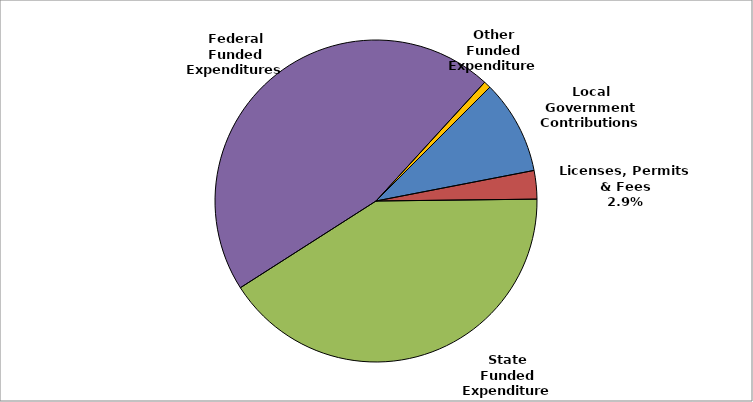
| Category | Series 0 |
|---|---|
| Local Government Contributions | 0.095 |
| Licenses, Permits & Fees | 0.029 |
| State Funded Expenditures | 0.411 |
| Federal Funded Expenditures | 0.458 |
| Other Funded Expenditures | 0.007 |